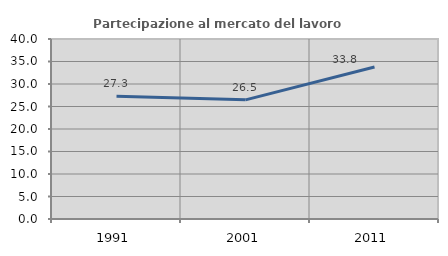
| Category | Partecipazione al mercato del lavoro  femminile |
|---|---|
| 1991.0 | 27.305 |
| 2001.0 | 26.482 |
| 2011.0 | 33.784 |